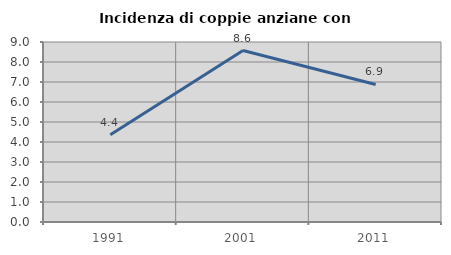
| Category | Incidenza di coppie anziane con figli |
|---|---|
| 1991.0 | 4.365 |
| 2001.0 | 8.571 |
| 2011.0 | 6.878 |